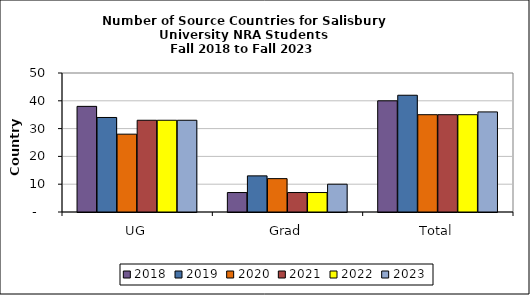
| Category | 2018 | 2019 | 2020 | 2021 | 2022 | 2023 |
|---|---|---|---|---|---|---|
| UG | 38 | 34 | 28 | 33 | 33 | 33 |
| Grad | 7 | 13 | 12 | 7 | 7 | 10 |
| Total | 40 | 42 | 35 | 35 | 35 | 36 |